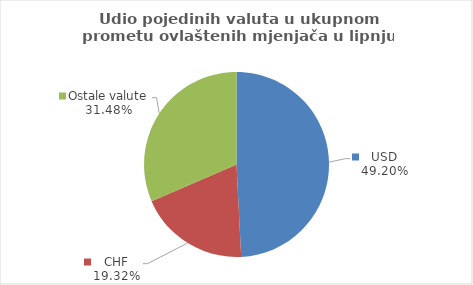
| Category | Series 0 |
|---|---|
| USD | 49.197 |
| CHF | 19.321 |
| Ostale valute | 31.482 |